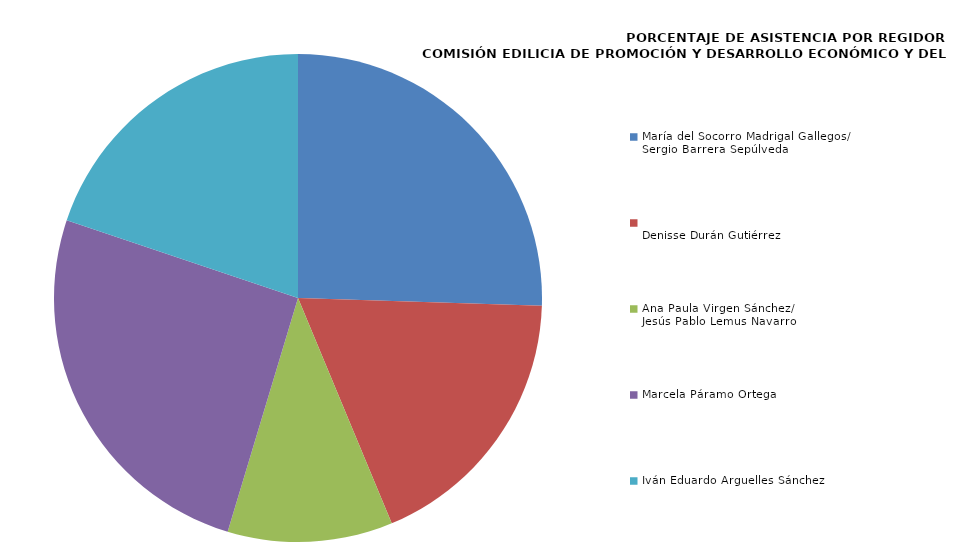
| Category | Series 0 |
|---|---|
| María del Socorro Madrigal Gallegos/
Sergio Barrera Sepúlveda | 100 |
| 
Denisse Durán Gutiérrez
 | 71.429 |
| Ana Paula Virgen Sánchez/ 
Jesús Pablo Lemus Navarro  | 42.857 |
| Marcela Páramo Ortega | 100 |
| Iván Eduardo Arguelles Sánchez  | 77.778 |